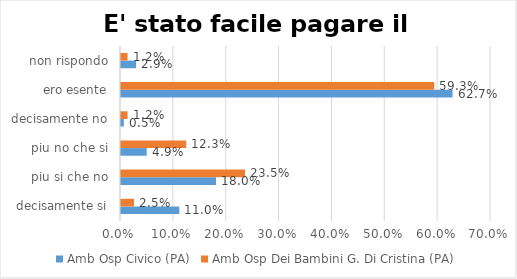
| Category | Amb Osp Civico (PA) | Amb Osp Dei Bambini G. Di Cristina (PA) |
|---|---|---|
| decisamente si | 0.11 | 0.025 |
| piu si che no | 0.18 | 0.235 |
| piu no che si | 0.049 | 0.123 |
| decisamente no | 0.005 | 0.012 |
| ero esente | 0.627 | 0.593 |
| non rispondo | 0.029 | 0.012 |